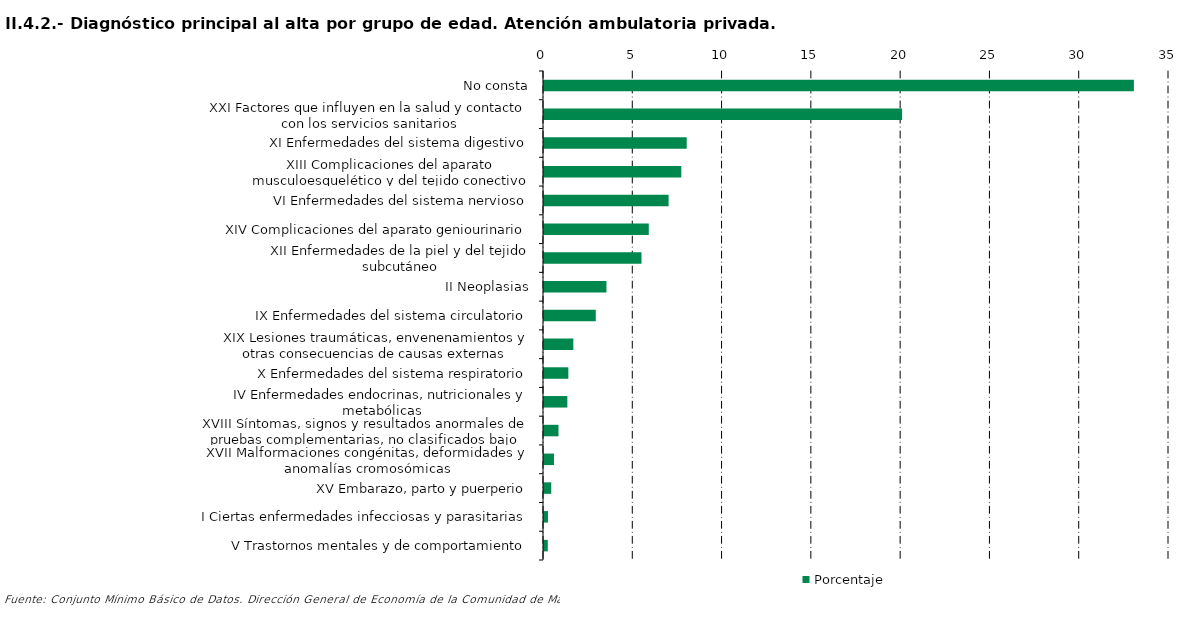
| Category | Porcentaje |
|---|---|
| No consta | 33.034 |
| XXI Factores que influyen en la salud y contacto con los servicios sanitarios | 20.054 |
| XI Enfermedades del sistema digestivo | 7.992 |
| XIII Complicaciones del aparato musculoesquelético y del tejido conectivo | 7.689 |
| VI Enfermedades del sistema nervioso | 6.978 |
| XIV Complicaciones del aparato geniourinario | 5.868 |
| XII Enfermedades de la piel y del tejido subcutáneo | 5.461 |
| II Neoplasias | 3.498 |
| IX Enfermedades del sistema circulatorio | 2.899 |
| XIX Lesiones traumáticas, envenenamientos y otras consecuencias de causas externas | 1.643 |
| X Enfermedades del sistema respiratorio | 1.363 |
| IV Enfermedades endocrinas, nutricionales y metabólicas | 1.307 |
| XVIII Síntomas, signos y resultados anormales de pruebas complementarias, no clasificados bajo otro concepto | 0.811 |
| XVII Malformaciones congénitas, deformidades y anomalías cromosómicas | 0.559 |
| XV Embarazo, parto y puerperio | 0.406 |
| I Ciertas enfermedades infecciosas y parasitarias | 0.222 |
| V Trastornos mentales y de comportamiento | 0.212 |